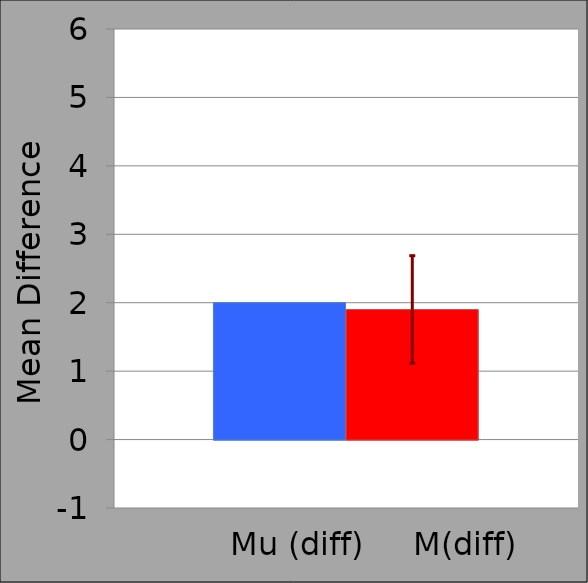
| Category | mu (diff) | M (diff) |
|---|---|---|
|  | 2 | 1.9 |